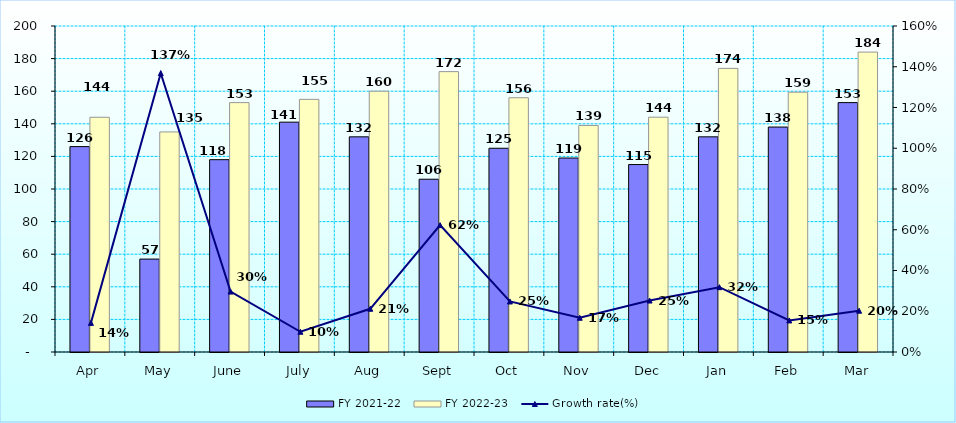
| Category | FY 2021-22 | FY 2022-23 |
|---|---|---|
| Apr | 126 | 144 |
| May | 57 | 135 |
| June | 118 | 153 |
| July | 141 | 155 |
| Aug | 132 | 160 |
| Sept | 106 | 172 |
| Oct | 125 | 156 |
| Nov | 119 | 139 |
| Dec | 115 | 144.048 |
| Jan | 132 | 174 |
| Feb | 138 | 159.377 |
| Mar | 153 | 184 |